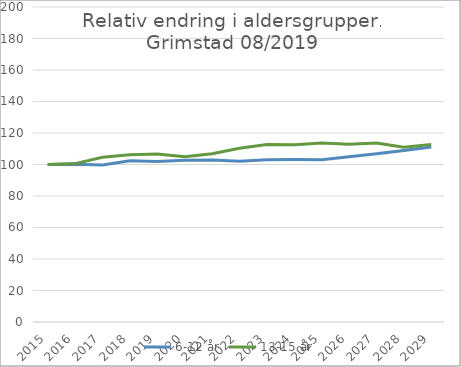
| Category | 6-12 år | 13-15 år |
|---|---|---|
| 2015.0 | 100 | 100 |
| 2016.0 | 100.189 | 100.561 |
| 2017.0 | 99.716 | 104.596 |
| 2018.0 | 102.367 | 106.166 |
| 2019.0 | 101.975 | 106.616 |
| 2020.0 | 102.744 | 104.868 |
| 2021.0 | 102.93 | 106.878 |
| 2022.0 | 102.05 | 110.348 |
| 2023.0 | 102.973 | 112.696 |
| 2024.0 | 103.173 | 112.597 |
| 2025.0 | 102.991 | 113.646 |
| 2026.0 | 104.972 | 112.83 |
| 2027.0 | 106.833 | 113.715 |
| 2028.0 | 108.922 | 110.911 |
| 2029.0 | 111.18 | 112.67 |